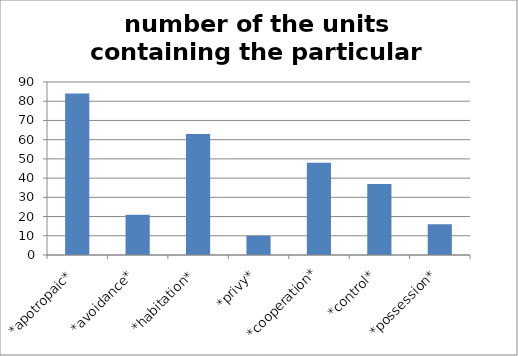
| Category | Series 0 |
|---|---|
| *apotropaic* | 84 |
| *avoidance* | 21 |
| *habitation* | 63 |
| *privy* | 10 |
| *cooperation* | 48 |
| *control* | 37 |
| *possession* | 16 |